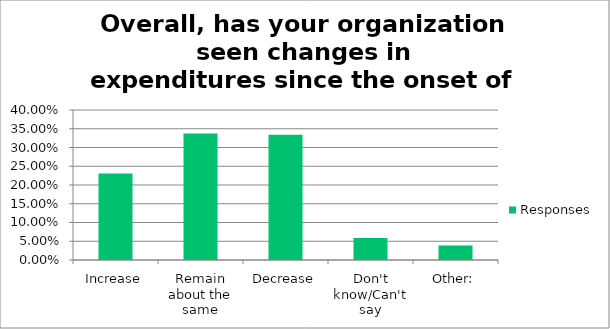
| Category | Responses |
|---|---|
| Increase | 0.231 |
| Remain about the same | 0.337 |
| Decrease | 0.334 |
| Don't know/Can't say | 0.059 |
| Other: | 0.039 |